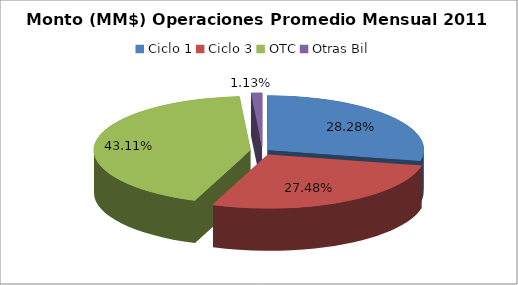
| Category | Series 0 |
|---|---|
| Ciclo 1 | 13361368.533 |
| Ciclo 3 | 12987087.45 |
| OTC | 20370468.421 |
| Otras Bil | 533963.228 |